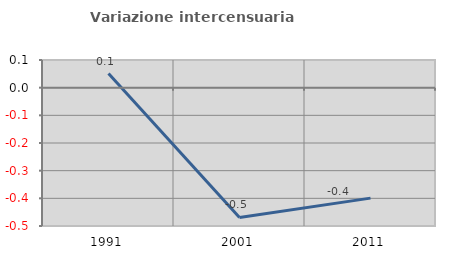
| Category | Variazione intercensuaria annua |
|---|---|
| 1991.0 | 0.051 |
| 2001.0 | -0.469 |
| 2011.0 | -0.399 |